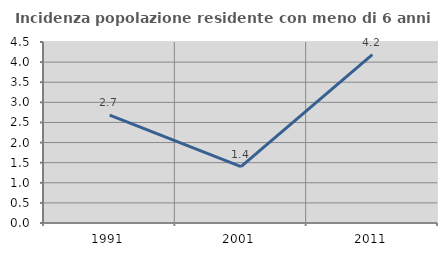
| Category | Incidenza popolazione residente con meno di 6 anni |
|---|---|
| 1991.0 | 2.682 |
| 2001.0 | 1.402 |
| 2011.0 | 4.188 |